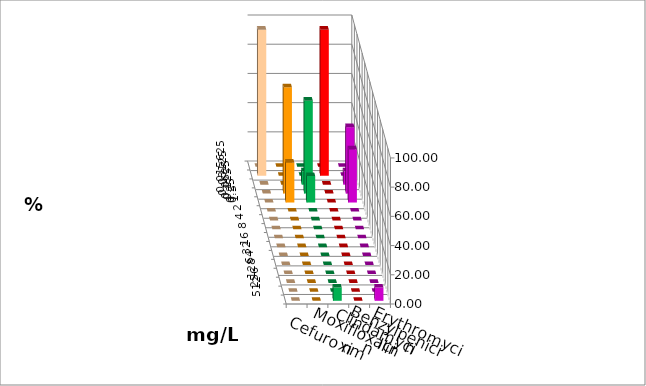
| Category | Cefuroxim | Moxifloxacin | Clindamycin | Benzylpenicillin | Erythromycin |
|---|---|---|---|---|---|
| 0.015625 | 0 | 0 | 0 | 0 | 0 |
| 0.03125 | 100 | 0 | 0 | 100 | 0 |
| 0.0625 | 0 | 0 | 9.091 | 0 | 9.091 |
| 0.125 | 0 | 72.727 | 63.636 | 0 | 45.455 |
| 0.25 | 0 | 27.273 | 18.182 | 0 | 36.364 |
| 0.5 | 0 | 0 | 0 | 0 | 0 |
| 1.0 | 0 | 0 | 0 | 0 | 0 |
| 2.0 | 0 | 0 | 0 | 0 | 0 |
| 4.0 | 0 | 0 | 0 | 0 | 0 |
| 8.0 | 0 | 0 | 0 | 0 | 0 |
| 16.0 | 0 | 0 | 0 | 0 | 0 |
| 32.0 | 0 | 0 | 0 | 0 | 0 |
| 64.0 | 0 | 0 | 0 | 0 | 0 |
| 128.0 | 0 | 0 | 0 | 0 | 0 |
| 256.0 | 0 | 0 | 0 | 0 | 0 |
| 512.0 | 0 | 0 | 9.091 | 0 | 9.091 |